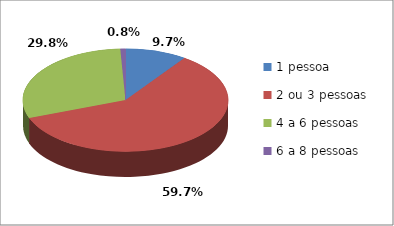
| Category | Series 0 |
|---|---|
| 1 pessoa | 12 |
| 2 ou 3 pessoas | 74 |
| 4 a 6 pessoas | 37 |
| 6 a 8 pessoas | 1 |